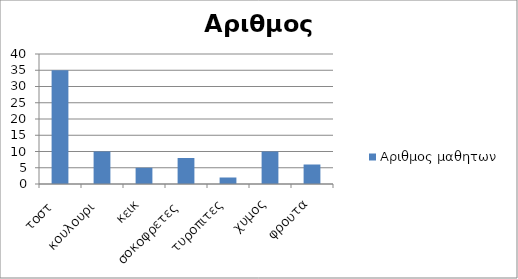
| Category | Αριθμος μαθητων |
|---|---|
| τοστ  | 35 |
| κουλουρι  | 10 |
| κεικ | 5 |
| σοκοφρετες  | 8 |
| τυροπιτες | 2 |
| χυμος | 10 |
| φρουτα | 6 |